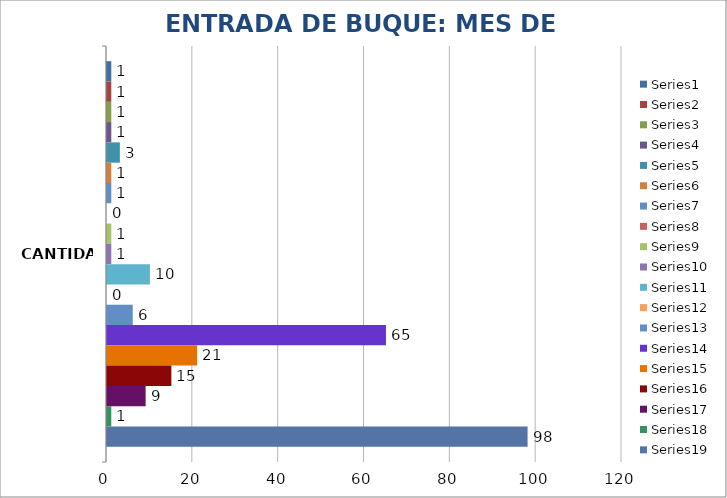
| Category | Series 0 | Series 1 | Series 2 | Series 3 | Series 4 | Series 5 | Series 6 | Series 7 | Series 8 | Series 9 | Series 10 | Series 11 | Series 12 | Series 13 | Series 14 | Series 15 | Series 16 | Series 17 | Series 18 |
|---|---|---|---|---|---|---|---|---|---|---|---|---|---|---|---|---|---|---|---|
| CANTIDAD | 1 | 1 | 1 | 1 | 3 | 1 | 1 | 0 | 1 | 1 | 10 | 0 | 6 | 65 | 21 | 15 | 9 | 1 | 98 |